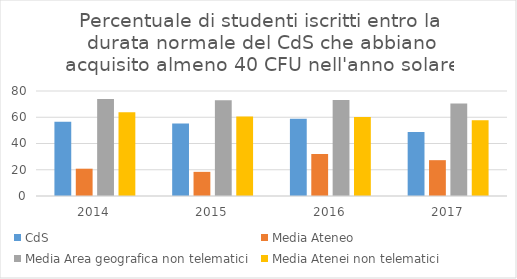
| Category | CdS | Media Ateneo | Media Area geografica non telematici | Media Atenei non telematici |
|---|---|---|---|---|
| 2014.0 | 56.5 | 20.8 | 73.9 | 63.8 |
| 2015.0 | 55.3 | 18.4 | 72.9 | 60.5 |
| 2016.0 | 58.8 | 32 | 73.1 | 60.1 |
| 2017.0 | 48.8 | 27.3 | 70.5 | 57.8 |